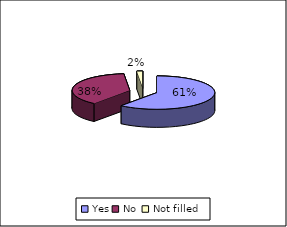
| Category | Did your GP offer you a choice of where you could have your treatment |
|---|---|
| Yes | 37 |
| No  | 23 |
| Not filled | 1 |